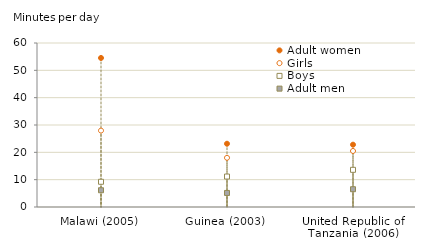
| Category | Adult women | Girls | Boys | Adult men |
|---|---|---|---|---|
| Malawi (2005) | 54.527 | 27.956 | 9.231 | 6.132 |
| Guinea (2003) | 23.143 | 18 | 11.143 | 5.143 |
| United Republic of Tanzania (2006) | 22.8 | 20.5 | 13.6 | 6.5 |